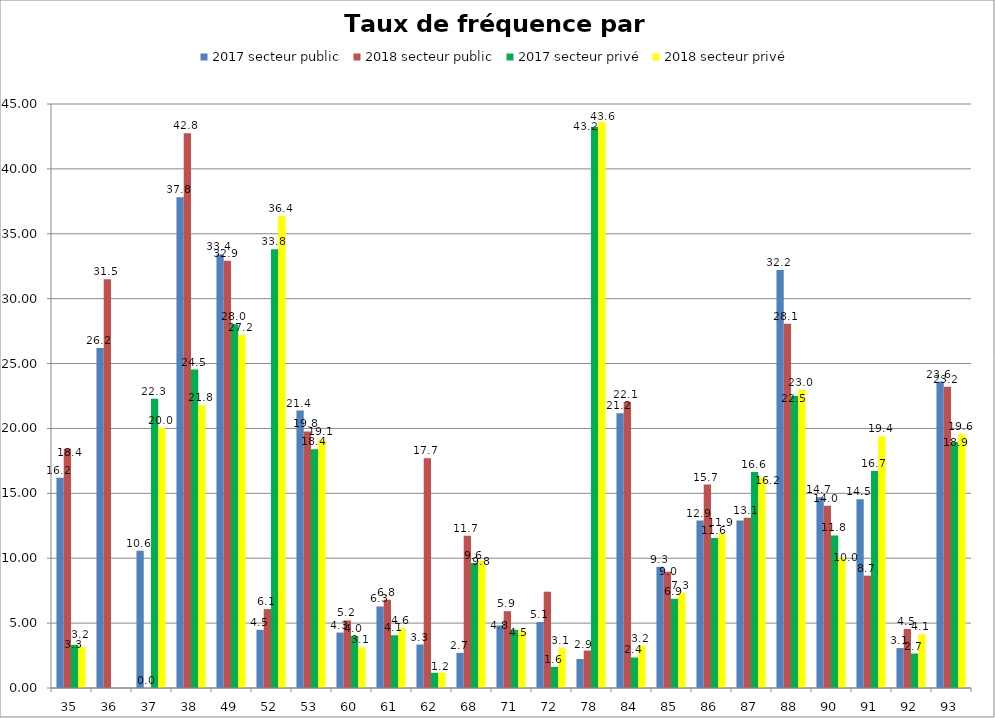
| Category | 2017 secteur public | 2018 secteur public | 2017 secteur privé | 2018 secteur privé |
|---|---|---|---|---|
| 35 | 16.197 | 18.432 | 3.324 | 3.174 |
| 36 | 26.203 | 31.505 | 0 | 0 |
| 37 | 10.573 | 0 | 22.29 | 20.05 |
| 38 | 37.816 | 42.752 | 24.535 | 21.796 |
| 49 | 33.407 | 32.916 | 28.027 | 27.205 |
| 52 | 4.483 | 6.08 | 33.804 | 36.364 |
| 53 | 21.375 | 19.765 | 18.392 | 19.148 |
| 60 | 4.272 | 5.205 | 3.999 | 3.135 |
| 61 | 6.284 | 6.798 | 4.063 | 4.597 |
| 62 | 3.349 | 17.709 | 1.172 | 1.184 |
| 68 | 2.705 | 11.738 | 9.635 | 9.787 |
| 71 | 4.819 | 5.916 | 4.485 | 4.415 |
| 72 | 5.083 | 7.42 | 1.628 | 3.089 |
| 78 | 2.235 | 2.885 | 43.248 | 43.627 |
| 84 | 21.172 | 22.057 | 2.353 | 3.247 |
| 85 | 9.341 | 8.961 | 6.872 | 7.327 |
| 86 | 12.899 | 15.673 | 11.565 | 11.867 |
| 87 | 12.909 | 13.114 | 16.646 | 16.216 |
| 88 | 32.199 | 28.062 | 22.505 | 22.975 |
| 90 | 14.691 | 14.035 | 11.758 | 10.008 |
| 91 | 14.549 | 8.656 | 16.713 | 19.395 |
| 92 | 3.078 | 4.548 | 2.657 | 4.142 |
| 93 | 23.603 | 23.209 | 18.936 | 19.562 |